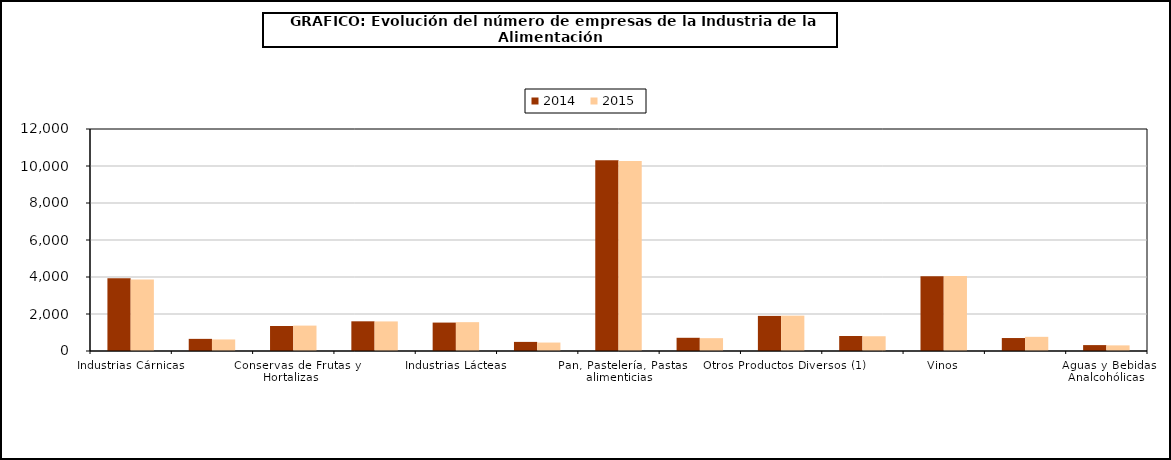
| Category | 2014 | 2015 |
|---|---|---|
| Industrias Cárnicas | 3926 | 3868 |
| Transformación de Pescado | 656 | 625 |
| Conservas de Frutas y Hortalizas   | 1353 | 1373 |
| Grasas y Aceites (Veg.y Anim.) | 1605 | 1599 |
| Industrias Lácteas | 1536 | 1559 |
| Productos Molinería | 492 | 457 |
| Pan, Pastelería, Pastas alimenticias | 10314 | 10272 |
| Azúcar, Chocolate y Confitería | 714 | 694 |
| Otros Productos Diversos (1) | 1897 | 1911 |
| Productos Alimentación Animal | 812 | 798 |
| Vinos | 4047 | 4052 |
| Otras Bebidas Alcohólicas (2) | 701 | 766 |
| Aguas y Bebidas Analcohólicas  | 319 | 304 |